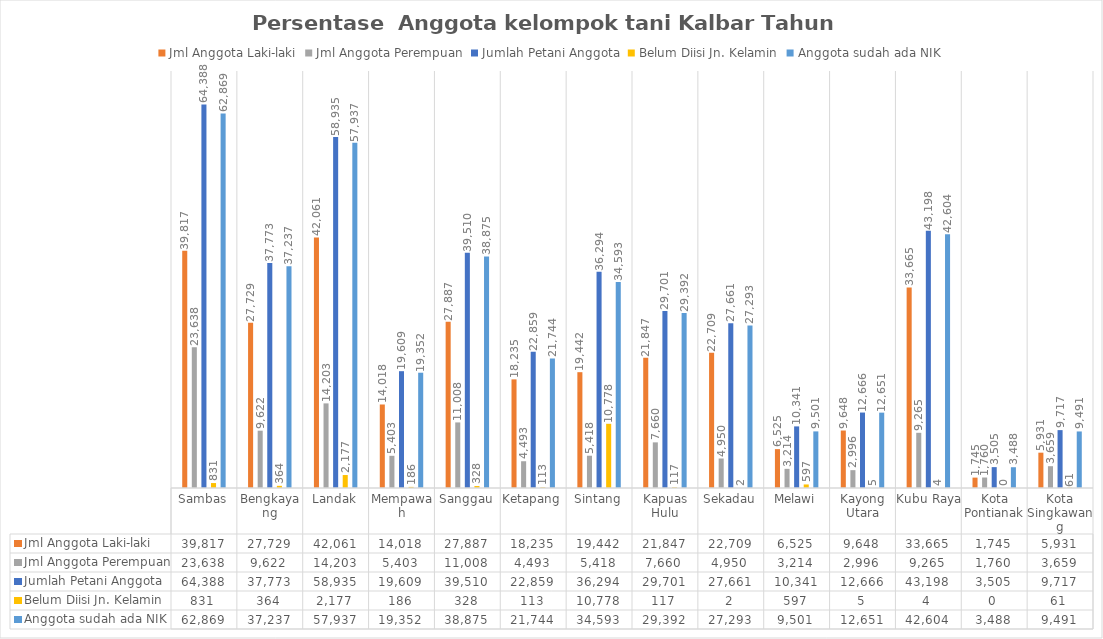
| Category | Jml Anggota Laki-laki | Jml Anggota Perempuan | Jumlah Petani Anggota | Belum Diisi Jn. Kelamin | Anggota sudah ada NIK |
|---|---|---|---|---|---|
| Sambas | 39817 | 23638 | 64388 | 831 | 62869 |
| Bengkayang | 27729 | 9622 | 37773 | 364 | 37237 |
| Landak | 42061 | 14203 | 58935 | 2177 | 57937 |
| Mempawah | 14018 | 5403 | 19609 | 186 | 19352 |
| Sanggau | 27887 | 11008 | 39510 | 328 | 38875 |
| Ketapang | 18235 | 4493 | 22859 | 113 | 21744 |
| Sintang | 19442 | 5418 | 36294 | 10778 | 34593 |
| Kapuas Hulu | 21847 | 7660 | 29701 | 117 | 29392 |
| Sekadau | 22709 | 4950 | 27661 | 2 | 27293 |
| Melawi | 6525 | 3214 | 10341 | 597 | 9501 |
| Kayong Utara | 9648 | 2996 | 12666 | 5 | 12651 |
| Kubu Raya | 33665 | 9265 | 43198 | 4 | 42604 |
| Kota Pontianak | 1745 | 1760 | 3505 | 0 | 3488 |
| Kota Singkawang | 5931 | 3659 | 9717 | 61 | 9491 |